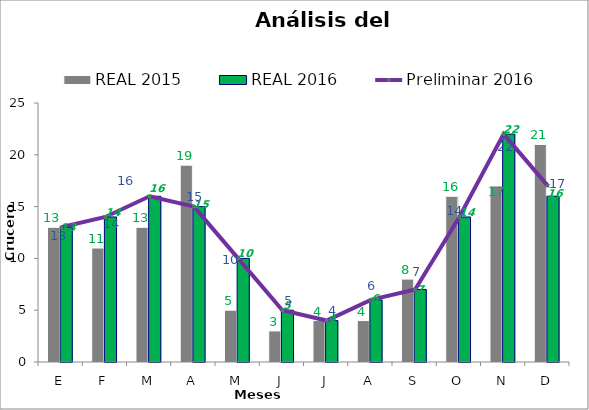
| Category | REAL 2015 | REAL 2016 |
|---|---|---|
| E | 13 | 13 |
| F | 11 | 14 |
| M | 13 | 16 |
| A | 19 | 15 |
| M | 5 | 10 |
| J | 3 | 5 |
| J | 4 | 4 |
| A | 4 | 6 |
| S | 8 | 7 |
| O | 16 | 14 |
| N | 17 | 22 |
| D | 21 | 16 |